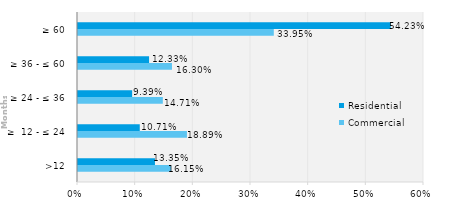
| Category | Commercial | Residential |
|---|---|---|
| >12 | 0.162 | 0.133 |
| ≥  12 - ≤ 24 | 0.189 | 0.107 |
| ≥ 24 - ≤ 36 | 0.147 | 0.094 |
| ≥ 36 - ≤ 60 | 0.163 | 0.123 |
| ≥ 60 | 0.34 | 0.542 |